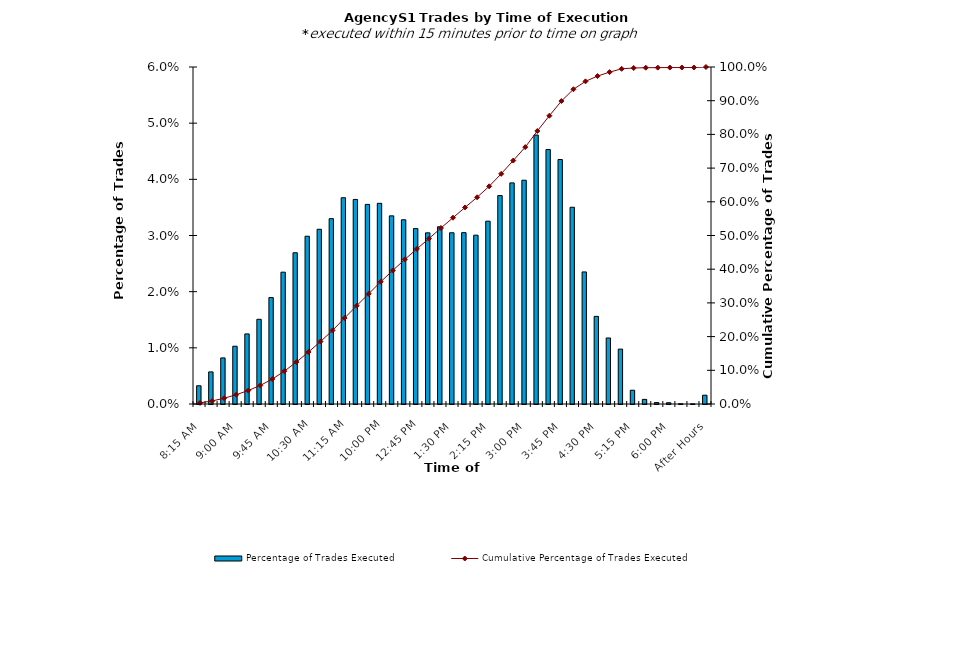
| Category | Percentage of Trades Executed |
|---|---|
| 8:15 AM | 0.003 |
| 8:30 AM | 0.006 |
| 8:45 AM | 0.008 |
| 9:00 AM | 0.01 |
| 9:15 AM | 0.012 |
| 9:30 AM | 0.015 |
| 9:45 AM | 0.019 |
| 10:00 AM | 0.023 |
| 10:15 AM | 0.027 |
| 10:30 AM | 0.03 |
| 10:45 AM | 0.031 |
| 11:00 AM | 0.033 |
| 11:15 AM | 0.037 |
| 11:30 AM | 0.036 |
| 11:45 AM | 0.036 |
| 12:00 PM | 0.036 |
| 12:15 PM | 0.033 |
| 12:30 PM | 0.033 |
| 12:45 PM | 0.031 |
| 1:00 PM | 0.03 |
| 1:15 PM | 0.032 |
| 1:30 PM | 0.03 |
| 1:45 PM | 0.031 |
| 2:00 PM | 0.03 |
| 2:15 PM | 0.033 |
| 2:30 PM | 0.037 |
| 2:45 PM | 0.039 |
| 3:00 PM | 0.04 |
| 3:15 PM | 0.048 |
| 3:30 PM | 0.045 |
| 3:45 PM | 0.044 |
| 4:00 PM | 0.035 |
| 4:15 PM | 0.024 |
| 4:30 PM | 0.016 |
| 4:45 PM | 0.012 |
| 5:00 PM | 0.01 |
| 5:15 PM | 0.002 |
| 5:30 PM | 0.001 |
| 5:45 PM | 0 |
| 6:00 PM | 0 |
| 6:15 PM | 0 |
| 6:30 PM | 0 |
| After Hours | 0.002 |